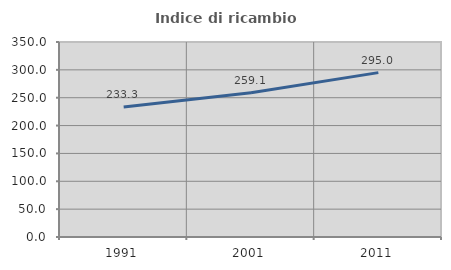
| Category | Indice di ricambio occupazionale  |
|---|---|
| 1991.0 | 233.333 |
| 2001.0 | 259.091 |
| 2011.0 | 295 |